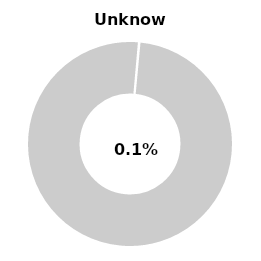
| Category | Series 0 |
|---|---|
| Unknown | 0.001 |
| Other | 0.999 |